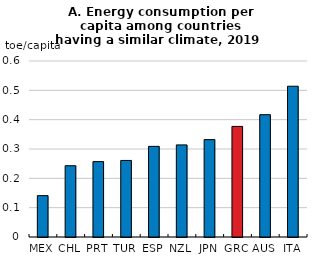
| Category | EI_PC |
|---|---|
| MEX | 0.141 |
| CHL | 0.243 |
| PRT | 0.257 |
| TUR | 0.261 |
| ESP | 0.309 |
| NZL | 0.314 |
| JPN | 0.332 |
| GRC | 0.377 |
| AUS | 0.417 |
| ITA | 0.514 |